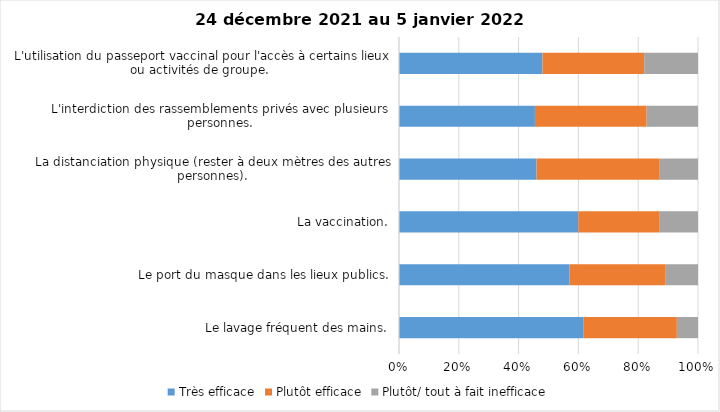
| Category | Très efficace | Plutôt efficace | Plutôt/ tout à fait inefficace |
|---|---|---|---|
| Le lavage fréquent des mains. | 61 | 31 | 7 |
| Le port du masque dans les lieux publics. | 57 | 32 | 11 |
| La vaccination. | 60 | 27 | 13 |
| La distanciation physique (rester à deux mètres des autres personnes). | 46 | 41 | 13 |
| L'interdiction des rassemblements privés avec plusieurs personnes. | 45 | 37 | 17 |
| L'utilisation du passeport vaccinal pour l'accès à certains lieux ou activités de groupe.  | 48 | 34 | 18 |